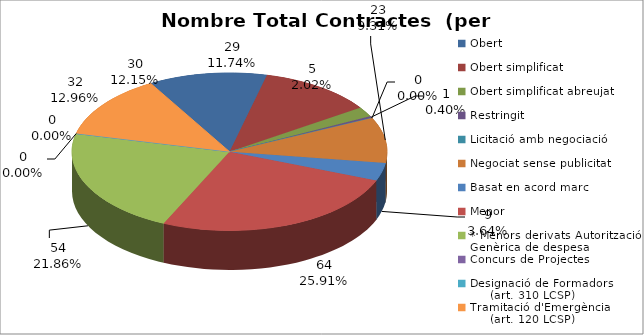
| Category | Nombre Total Contractes |
|---|---|
| Obert | 30 |
| Obert simplificat | 29 |
| Obert simplificat abreujat | 5 |
| Restringit | 1 |
| Licitació amb negociació | 0 |
| Negociat sense publicitat | 23 |
| Basat en acord marc | 9 |
| Menor | 64 |
| * Menors derivats Autorització Genèrica de despesa | 54 |
| Concurs de Projectes | 0 |
| Designació de Formadors
     (art. 310 LCSP) | 0 |
| Tramitació d'Emergència
     (art. 120 LCSP) | 32 |